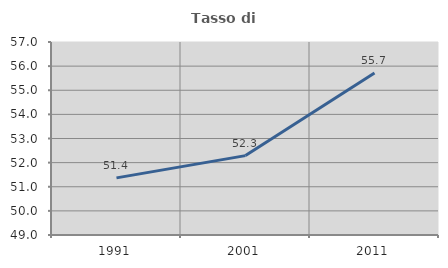
| Category | Tasso di occupazione   |
|---|---|
| 1991.0 | 51.368 |
| 2001.0 | 52.291 |
| 2011.0 | 55.717 |